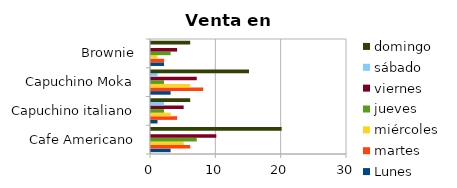
| Category | Lunes | martes | miércoles | jueves | viernes | sábado | domingo |
|---|---|---|---|---|---|---|---|
| Cafe Americano | 3 | 6 | 5 | 7 | 10 | 0 | 20 |
| Capuchino italiano | 1 | 4 | 3 | 2 | 5 | 2 | 6 |
| Capuchino Moka | 3 | 8 | 6 | 2 | 7 | 1 | 15 |
| Brownie | 2 | 2 | 1 | 3 | 4 | 0 | 6 |